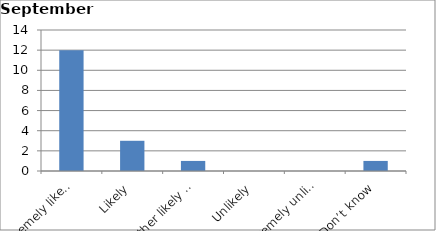
| Category | Series 0 |
|---|---|
| Extremely likely | 12 |
| Likely | 3 |
| Neither likely nor unlikely | 1 |
| Unlikely | 0 |
| Extremely unlikely | 0 |
| Don’t know | 1 |